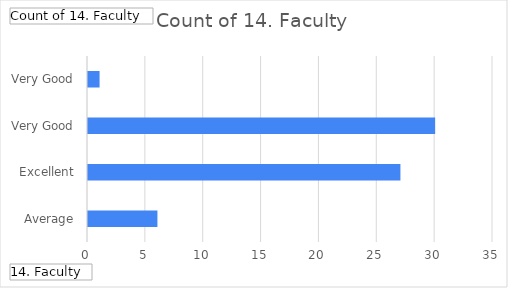
| Category | Total |
|---|---|
| Average | 6 |
| Excellent | 27 |
| Very Good | 30 |
| Very Good, Average | 1 |